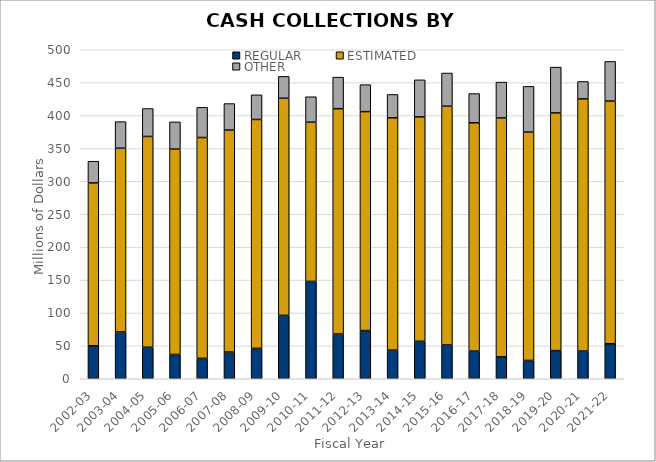
| Category | REGULAR | ESTIMATED | OTHER |
|---|---|---|---|
| 2002-03 | 50.156 | 247.479 | 32.974 |
| 2003-04 | 71.153 | 279.18 | 40.434 |
| 2004-05 | 47.898 | 320.33 | 42.472 |
| 2005-06 | 36.945 | 312.057 | 41.369 |
| 2006-07 | 30.99 | 335.61 | 45.89 |
| 2007-08 | 40.655 | 337.282 | 40.292 |
| 2008-09 | 46.228 | 347.858 | 37.449 |
| 2009-10 | 96.371 | 329.988 | 33.17 |
| 2010-11 | 147.921 | 242 | 38.673 |
| 2011-12 | 67.989 | 342.457 | 47.962 |
| 2012-13 | 73.281 | 332.719 | 40.947 |
| 2013-14 | 43.51 | 353.125 | 35.438 |
| 2014-15 | 56.952 | 341.119 | 56.236 |
| 2015-16 | 51.342 | 362.824 | 50.46 |
| 2016-17 | 42.017 | 347.03 | 44.378 |
| 2017-18 | 33.297 | 363.072 | 54.488 |
| 2018-19 | 27.847 | 347.081 | 69.375 |
| 2019-20 | 42.809 | 361.23 | 69.54 |
| 2020-21 | 42.072 | 383.195 | 26.517 |
| 2021-22 | 53.212 | 368.72 | 60.352 |